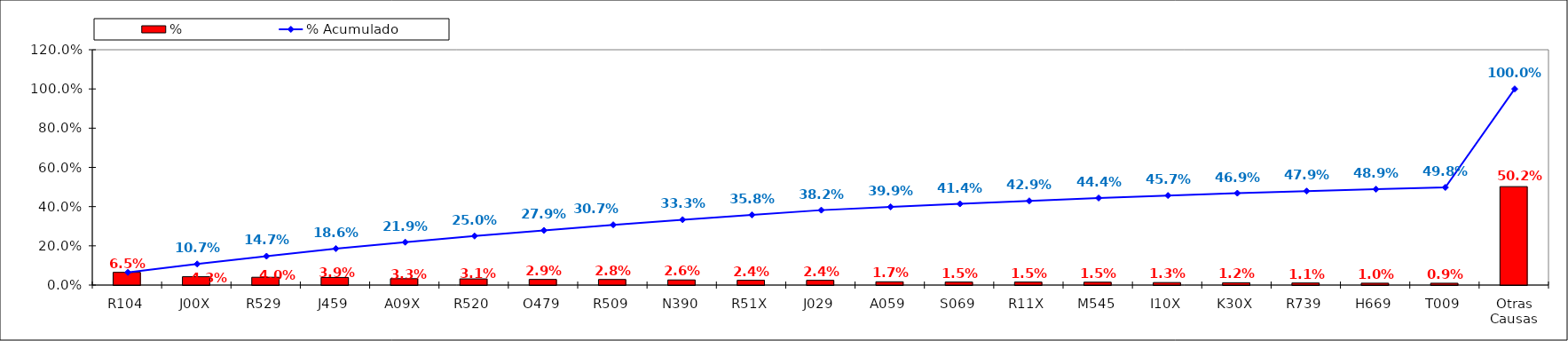
| Category | % |
|---|---|
| R104 | 0.065 |
| J00X | 0.043 |
| R529 | 0.04 |
| J459 | 0.039 |
| A09X | 0.033 |
| R520 | 0.031 |
| O479 | 0.029 |
| R509 | 0.028 |
| N390 | 0.026 |
| R51X | 0.024 |
| J029 | 0.024 |
| A059 | 0.017 |
| S069 | 0.015 |
| R11X | 0.015 |
| M545 | 0.015 |
| I10X | 0.013 |
| K30X | 0.012 |
| R739 | 0.011 |
| H669 | 0.01 |
| T009 | 0.009 |
| Otras Causas | 0.502 |